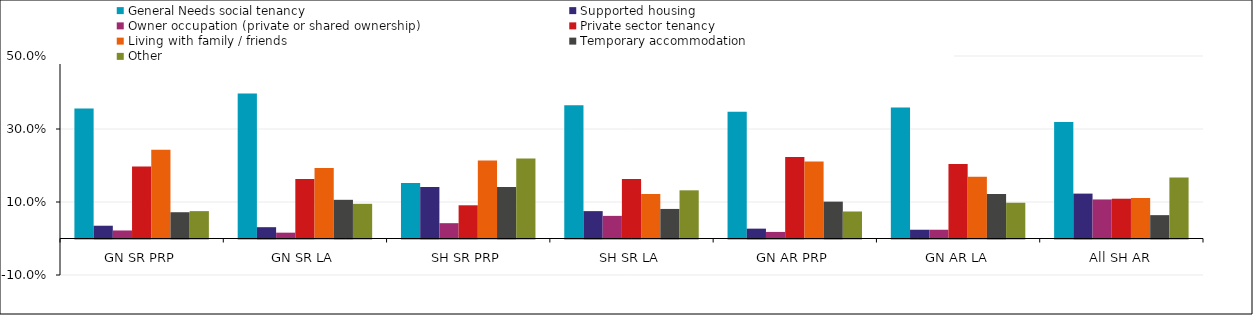
| Category | General Needs social tenancy | Supported housing | Owner occupation (private or shared ownership) | Private sector tenancy | Living with family / friends | Temporary accommodation | Other |
|---|---|---|---|---|---|---|---|
| GN SR PRP | 0.356 | 0.035 | 0.022 | 0.197 | 0.243 | 0.072 | 0.075 |
| GN SR LA | 0.397 | 0.031 | 0.016 | 0.163 | 0.193 | 0.106 | 0.095 |
| SH SR PRP | 0.152 | 0.141 | 0.042 | 0.091 | 0.214 | 0.141 | 0.219 |
| SH SR LA | 0.365 | 0.075 | 0.062 | 0.163 | 0.122 | 0.081 | 0.132 |
| GN AR PRP | 0.347 | 0.027 | 0.018 | 0.223 | 0.211 | 0.101 | 0.074 |
| GN AR LA | 0.359 | 0.024 | 0.024 | 0.204 | 0.169 | 0.122 | 0.098 |
| All SH AR | 0.319 | 0.123 | 0.107 | 0.109 | 0.111 | 0.064 | 0.167 |